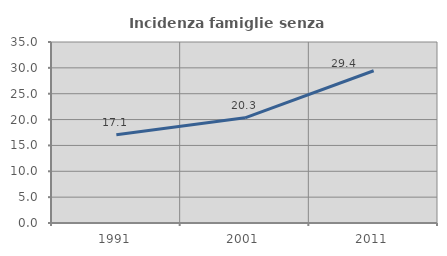
| Category | Incidenza famiglie senza nuclei |
|---|---|
| 1991.0 | 17.084 |
| 2001.0 | 20.341 |
| 2011.0 | 29.443 |